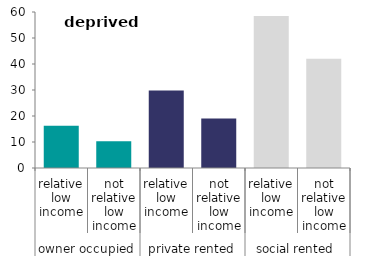
| Category | deprived areas |
|---|---|
| 0 | 16.229 |
| 1 | 10.332 |
| 2 | 29.82 |
| 3 | 19.022 |
| 4 | 58.434 |
| 5 | 41.998 |